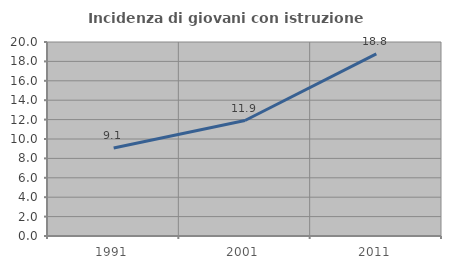
| Category | Incidenza di giovani con istruzione universitaria |
|---|---|
| 1991.0 | 9.073 |
| 2001.0 | 11.905 |
| 2011.0 | 18.777 |